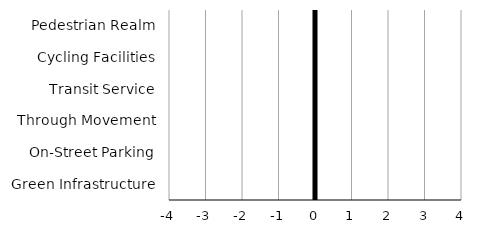
| Category | Exceeds / Fails to Meet Priorities |
|---|---|
| Pedestrian Realm | 0 |
| Cycling Facilities | 0 |
| Transit Service | 0 |
| Through Movement | 0 |
| On-Street Parking | 0 |
| Green Infrastructure | 0 |